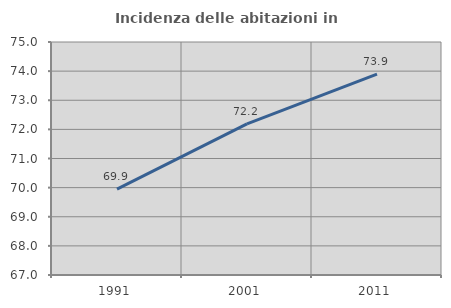
| Category | Incidenza delle abitazioni in proprietà  |
|---|---|
| 1991.0 | 69.948 |
| 2001.0 | 72.186 |
| 2011.0 | 73.896 |